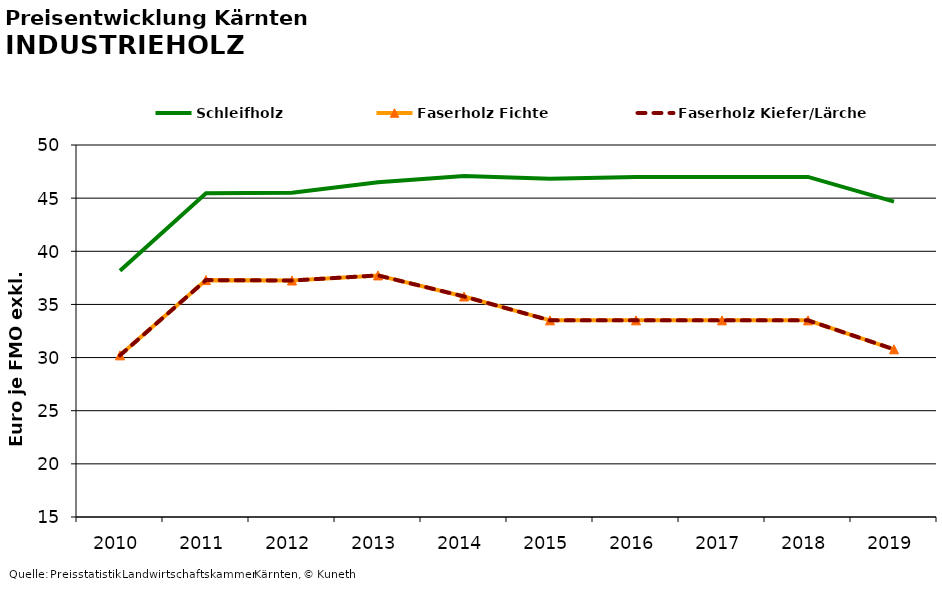
| Category | Schleifholz | Faserholz Fichte | Faserholz Kiefer/Lärche |
|---|---|---|---|
| 2010.0 | 38.167 | 30.208 | 30.208 |
| 2011.0 | 45.458 | 37.292 | 37.292 |
| 2012.0 | 45.5 | 37.25 | 37.25 |
| 2013.0 | 46.5 | 37.729 | 37.729 |
| 2014.0 | 47.083 | 35.75 | 35.75 |
| 2015.0 | 46.833 | 33.5 | 33.5 |
| 2016.0 | 47 | 33.5 | 33.5 |
| 2017.0 | 47 | 33.5 | 33.5 |
| 2018.0 | 47 | 33.5 | 33.5 |
| 2019.0 | 44.667 | 30.778 | 30.778 |